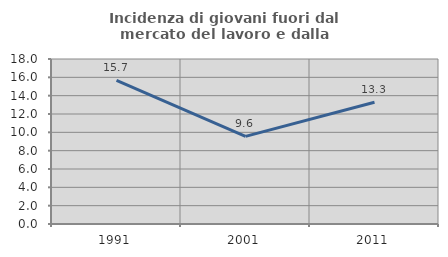
| Category | Incidenza di giovani fuori dal mercato del lavoro e dalla formazione  |
|---|---|
| 1991.0 | 15.672 |
| 2001.0 | 9.559 |
| 2011.0 | 13.281 |